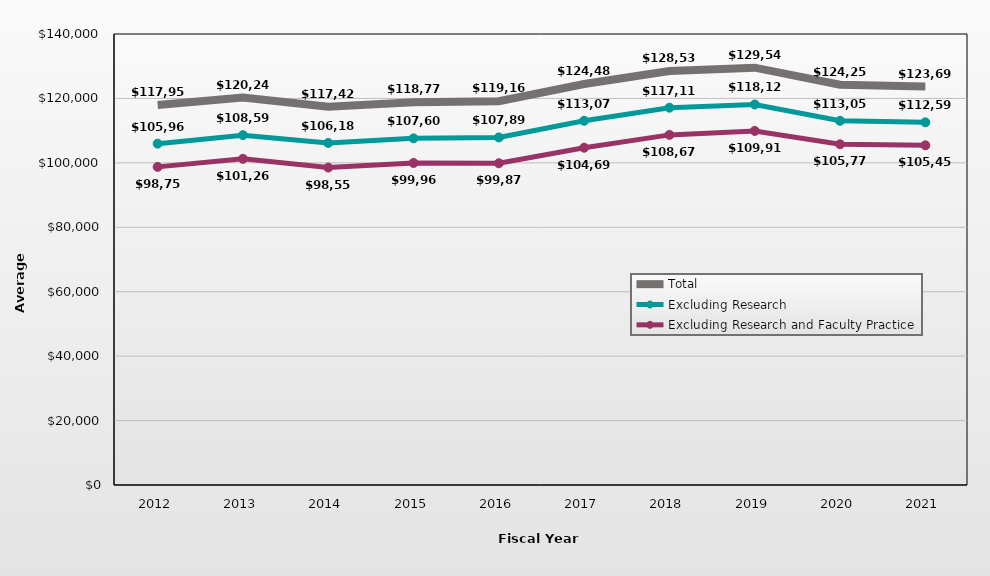
| Category | Total | Excluding Research | Excluding Research and Faculty Practice |
|---|---|---|---|
| 2012.0 | 117959 | 105962 | 98752 |
| 2013.0 | 120248 | 108596 | 101261 |
| 2014.0 | 117425 | 106187 | 98550 |
| 2015.0 | 118778 | 107606 | 99966 |
| 2016.0 | 119160 | 107892 | 99873 |
| 2017.0 | 124487 | 113070 | 104698 |
| 2018.0 | 128535 | 117119 | 108679 |
| 2019.0 | 129549 | 118124 | 109912 |
| 2020.0 | 124258 | 113054 | 105771 |
| 2021.0 | 123690 | 112590 | 105452 |